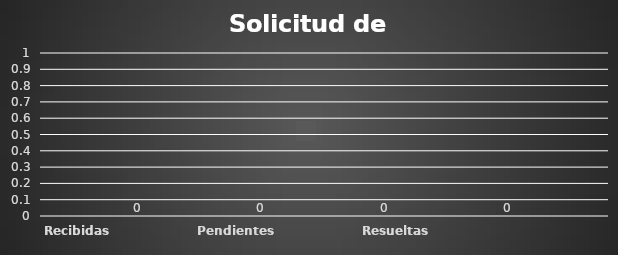
| Category | Recibidas  | Pendientes  | Resueltas | Rechazadas  |
|---|---|---|---|---|
| Recibidas  | 0 | 0 | 0 | 0 |